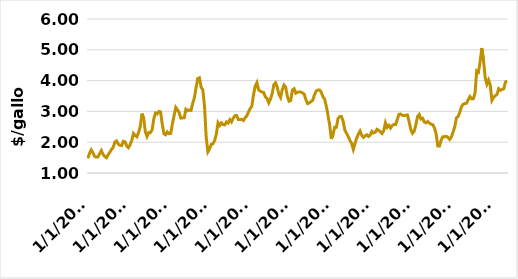
| Category | Series 0 |
|---|---|
| 1/1/03 | 1.473 |
| 2/1/03 | 1.641 |
| 3/1/03 | 1.748 |
| 4/1/03 | 1.659 |
| 5/1/03 | 1.542 |
| 6/1/03 | 1.514 |
| 7/1/03 | 1.524 |
| 8/1/03 | 1.628 |
| 9/1/03 | 1.728 |
| 10/1/03 | 1.603 |
| 11/1/03 | 1.535 |
| 12/1/03 | 1.494 |
| 1/1/04 | 1.592 |
| 2/1/04 | 1.672 |
| 3/1/04 | 1.766 |
| 4/1/04 | 1.833 |
| 5/1/04 | 2.009 |
| 6/1/04 | 2.041 |
| 7/1/04 | 1.939 |
| 8/1/04 | 1.898 |
| 9/1/04 | 1.891 |
| 10/1/04 | 2.029 |
| 11/1/04 | 2.01 |
| 12/1/04 | 1.882 |
| 1/1/05 | 1.823 |
| 2/1/05 | 1.918 |
| 3/1/05 | 2.065 |
| 4/1/05 | 2.283 |
| 5/1/05 | 2.216 |
| 6/1/05 | 2.176 |
| 7/1/05 | 2.316 |
| 8/1/05 | 2.506 |
| 9/1/05 | 2.927 |
| 10/1/05 | 2.785 |
| 11/1/05 | 2.343 |
| 12/1/05 | 2.186 |
| 1/1/06 | 2.315 |
| 2/1/06 | 2.31 |
| 3/1/06 | 2.401 |
| 4/1/06 | 2.757 |
| 5/1/06 | 2.947 |
| 6/1/06 | 2.917 |
| 7/1/06 | 2.999 |
| 8/1/06 | 2.985 |
| 9/1/06 | 2.589 |
| 10/1/06 | 2.272 |
| 11/1/06 | 2.241 |
| 12/1/06 | 2.334 |
| 1/1/07 | 2.274 |
| 2/1/07 | 2.285 |
| 3/1/07 | 2.592 |
| 4/1/07 | 2.86 |
| 5/1/07 | 3.13 |
| 6/1/07 | 3.052 |
| 7/1/07 | 2.961 |
| 8/1/07 | 2.782 |
| 9/1/07 | 2.789 |
| 10/1/07 | 2.793 |
| 11/1/07 | 3.069 |
| 12/1/07 | 3.02 |
| 1/1/08 | 3.047 |
| 2/1/08 | 3.033 |
| 3/1/08 | 3.258 |
| 4/1/08 | 3.441 |
| 5/1/08 | 3.764 |
| 6/1/08 | 4.065 |
| 7/1/08 | 4.09 |
| 8/1/08 | 3.786 |
| 9/1/08 | 3.698 |
| 10/1/08 | 3.173 |
| 11/1/08 | 2.151 |
| 12/1/08 | 1.689 |
| 1/1/09 | 1.787 |
| 2/1/09 | 1.928 |
| 3/1/09 | 1.949 |
| 4/1/09 | 2.056 |
| 5/1/09 | 2.265 |
| 6/1/09 | 2.631 |
| 7/1/09 | 2.543 |
| 8/1/09 | 2.627 |
| 9/1/09 | 2.574 |
| 10/1/09 | 2.561 |
| 11/1/09 | 2.66 |
| 12/1/09 | 2.621 |
| 1/1/10 | 2.731 |
| 2/1/10 | 2.659 |
| 3/1/10 | 2.78 |
| 4/1/10 | 2.858 |
| 5/1/10 | 2.869 |
| 6/1/10 | 2.736 |
| 7/1/10 | 2.736 |
| 8/1/10 | 2.745 |
| 9/1/10 | 2.704 |
| 10/1/10 | 2.795 |
| 11/1/10 | 2.852 |
| 12/1/10 | 2.985 |
| 1/1/11 | 3.091 |
| 2/1/11 | 3.167 |
| 3/1/11 | 3.546 |
| 4/1/11 | 3.816 |
| 5/1/11 | 3.933 |
| 6/1/11 | 3.702 |
| 7/1/11 | 3.654 |
| 8/1/11 | 3.63 |
| 9/1/11 | 3.612 |
| 10/1/11 | 3.468 |
| 11/1/11 | 3.423 |
| 12/1/11 | 3.278 |
| 1/1/12 | 3.399 |
| 2/1/12 | 3.572 |
| 3/1/12 | 3.868 |
| 4/1/12 | 3.927 |
| 5/1/12 | 3.792 |
| 6/1/12 | 3.552 |
| 7/1/12 | 3.451 |
| 8/1/12 | 3.707 |
| 9/1/12 | 3.856 |
| 10/1/12 | 3.786 |
| 11/1/12 | 3.488 |
| 12/1/12 | 3.331 |
| 1/1/13 | 3.351 |
| 2/1/13 | 3.693 |
| 3/1/13 | 3.735 |
| 4/1/13 | 3.59 |
| 5/1/13 | 3.623 |
| 6/1/13 | 3.633 |
| 7/1/13 | 3.628 |
| 8/1/13 | 3.6 |
| 9/1/13 | 3.556 |
| 10/1/13 | 3.375 |
| 11/1/13 | 3.251 |
| 12/1/13 | 3.277 |
| 1/1/14 | 3.32 |
| 2/1/14 | 3.364 |
| 3/1/14 | 3.532 |
| 4/1/14 | 3.659 |
| 5/1/14 | 3.691 |
| 6/1/14 | 3.695 |
| 7/1/14 | 3.633 |
| 8/1/14 | 3.481 |
| 9/1/14 | 3.403 |
| 10/1/14 | 3.182 |
| 11/1/14 | 2.887 |
| 12/1/14 | 2.56 |
| 1/1/15 | 2.11 |
| 2/1/15 | 2.249 |
| 3/1/15 | 2.483 |
| 4/1/15 | 2.485 |
| 5/1/15 | 2.775 |
| 6/1/15 | 2.832 |
| 7/1/15 | 2.832 |
| 8/1/15 | 2.679 |
| 9/1/15 | 2.394 |
| 10/1/15 | 2.289 |
| 11/1/15 | 2.185 |
| 12/1/15 | 2.06 |
| 1/1/16 | 1.967 |
| 2/1/16 | 1.767 |
| 3/1/16 | 1.958 |
| 4/1/16 | 2.134 |
| 5/1/16 | 2.264 |
| 6/1/16 | 2.363 |
| 7/1/16 | 2.225 |
| 8/1/16 | 2.155 |
| 9/1/16 | 2.208 |
| 10/1/16 | 2.243 |
| 11/1/16 | 2.187 |
| 12/1/16 | 2.23 |
| 1/1/17 | 2.351 |
| 2/1/17 | 2.299 |
| 3/1/17 | 2.323 |
| 4/1/17 | 2.418 |
| 5/1/17 | 2.386 |
| 6/1/17 | 2.337 |
| 7/1/17 | 2.281 |
| 8/1/17 | 2.374 |
| 9/1/17 | 2.63 |
| 10/1/17 | 2.484 |
| 11/1/17 | 2.548 |
| 12/1/17 | 2.459 |
| 1/1/18 | 2.539 |
| 2/1/18 | 2.575 |
| 3/1/18 | 2.572 |
| 4/1/18 | 2.737 |
| 5/1/18 | 2.907 |
| 6/1/18 | 2.914 |
| 7/1/18 | 2.873 |
| 8/1/18 | 2.862 |
| 9/1/18 | 2.873 |
| 10/1/18 | 2.887 |
| 11/1/18 | 2.671 |
| 12/1/18 | 2.414 |
| 1/1/19 | 2.289 |
| 2/1/19 | 2.353 |
| 3/1/19 | 2.564 |
| 4/1/19 | 2.835 |
| 5/1/19 | 2.901 |
| 6/1/19 | 2.752 |
| 7/1/19 | 2.776 |
| 8/1/19 | 2.655 |
| 9/1/19 | 2.63 |
| 10/1/19 | 2.673 |
| 11/1/19 | 2.62 |
| 12/1/19 | 2.587 |
| 1/1/20 | 2.567 |
| 2/1/20 | 2.465 |
| 3/1/20 | 2.267 |
| 4/1/20 | 1.876 |
| 5/1/20 | 1.879 |
| 6/1/20 | 2.076 |
| 7/1/20 | 2.176 |
| 8/1/20 | 2.177 |
| 9/1/20 | 2.193 |
| 10/1/20 | 2.159 |
| 11/1/20 | 2.09 |
| 12/1/20 | 2.168 |
| 1/1/21 | 2.326 |
| 2/1/21 | 2.496 |
| 3/1/21 | 2.791 |
| 4/1/21 | 2.839 |
| 5/1/21 | 2.972 |
| 6/1/21 | 3.154 |
| 7/1/21 | 3.233 |
| 8/1/21 | 3.255 |
| 9/1/21 | 3.265 |
| 10/1/21 | 3.385 |
| 11/1/21 | 3.482 |
| 12/1/21 | 3.408 |
| 1/1/22 | 3.413 |
| 2/1/22 | 3.592 |
| 3/1/22 | 4.312 |
| 4/1/22 | 4.271 |
| 5/1/22 | 4.604 |
| 6/1/22 | 5.058 |
| 7/1/22 | 4.667 |
| 8/1/22 | 4.101 |
| 9/1/22 | 3.881 |
| 10/1/22 | 4.016 |
| 11/1/22 | 3.853 |
| 12/1/22 | 3.356 |
| 1/1/23 | 3.452 |
| 2/1/23 | 3.514 |
| 3/1/23 | 3.551 |
| 4/1/23 | 3.735 |
| 5/1/23 | 3.685 |
| 6/1/23 | 3.712 |
| 7/1/23 | 3.732 |
| 8/1/23 | 3.955 |
| 9/1/23 | 3.988 |